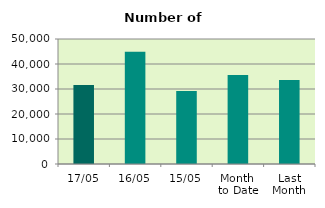
| Category | Series 0 |
|---|---|
| 17/05 | 31568 |
| 16/05 | 44922 |
| 15/05 | 29244 |
| Month 
to Date | 35635.833 |
| Last
Month | 33588.111 |